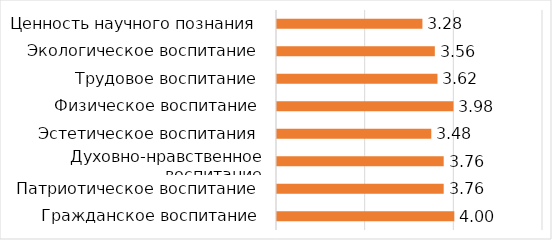
| Category | Series 1 |
|---|---|
| Гражданское воспитание | 4 |
| Патриотическое воспитание | 3.76 |
| Духовно-нравственное воспитание | 3.76 |
| Эстетическое воспитания | 3.48 |
| Физическое воспитание | 3.98 |
| Трудовое воспитание | 3.62 |
| Экологическое воспитание | 3.56 |
| Ценность научного познания | 3.28 |